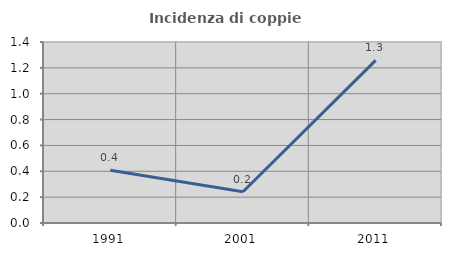
| Category | Incidenza di coppie miste |
|---|---|
| 1991.0 | 0.407 |
| 2001.0 | 0.242 |
| 2011.0 | 1.258 |